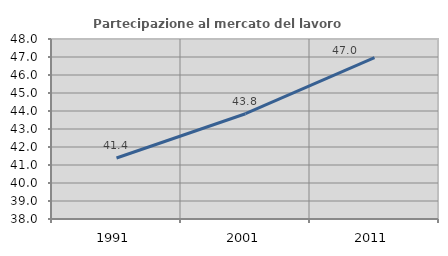
| Category | Partecipazione al mercato del lavoro  femminile |
|---|---|
| 1991.0 | 41.391 |
| 2001.0 | 43.848 |
| 2011.0 | 46.967 |